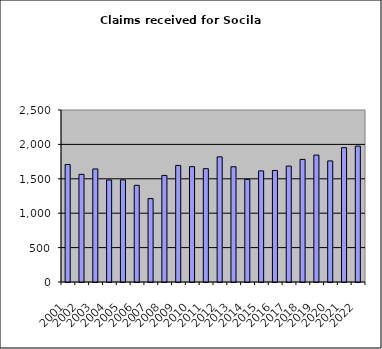
| Category | Series 0 |
|---|---|
| 2001.0 | 1708 |
| 2002.0 | 1565 |
| 2003.0 | 1643 |
| 2004.0 | 1483 |
| 2005.0 | 1485 |
| 2006.0 | 1405 |
| 2007.0 | 1212 |
| 2008.0 | 1549 |
| 2009.0 | 1694 |
| 2010.0 | 1676 |
| 2011.0 | 1647 |
| 2012.0 | 1819 |
| 2013.0 | 1675 |
| 2014.0 | 1492 |
| 2015.0 | 1615 |
| 2016.0 | 1621 |
| 2017.0 | 1685 |
| 2018.0 | 1782 |
| 2019.0 | 1845 |
| 2020.0 | 1760 |
| 2021.0 | 1952 |
| 2022.0 | 1975 |